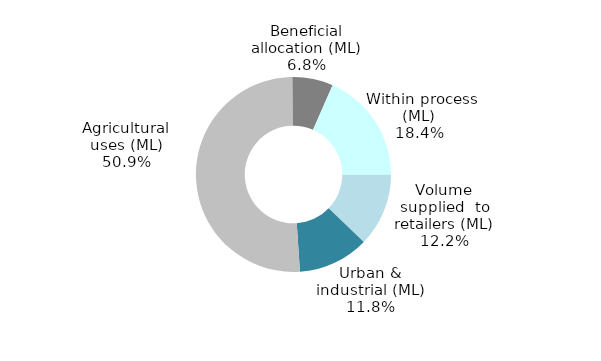
| Category | Series 3 |
|---|---|
| Volume supplied  to retailers (ML) | 0.122 |
| Urban & industrial (ML) | 0.118 |
| Agricultural uses (ML) | 0.509 |
| Beneficial allocation (ML) | 0.068 |
|  Within process (ML) | 0.184 |